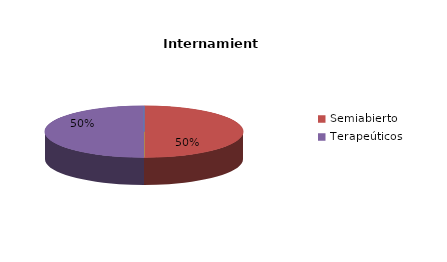
| Category | Series 0 |
|---|---|
| Cerrado | 0 |
| Semiabierto | 1 |
| Abierto | 0 |
| Terapeúticos | 1 |